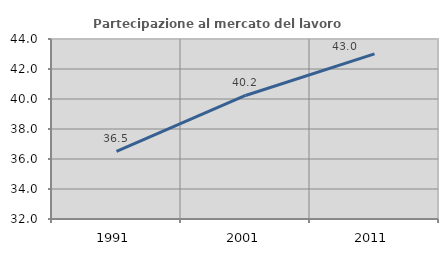
| Category | Partecipazione al mercato del lavoro  femminile |
|---|---|
| 1991.0 | 36.511 |
| 2001.0 | 40.234 |
| 2011.0 | 43.013 |